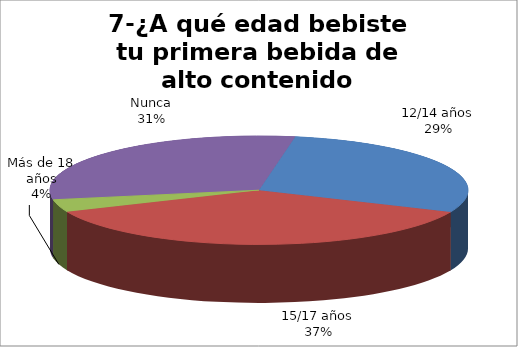
| Category | Series 0 |
|---|---|
| 12/14 años | 95 |
| 15/17 años | 122 |
| Más de 18 años | 12 |
| Nunca | 101 |